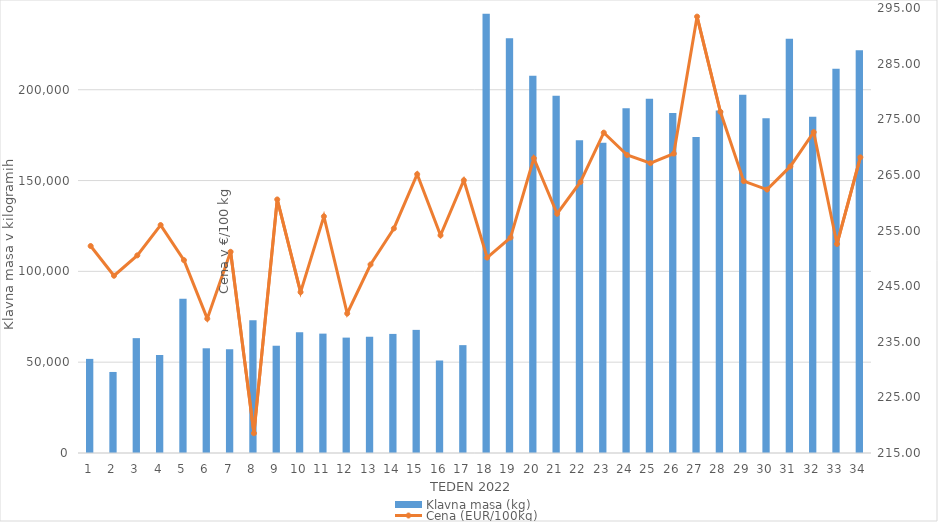
| Category | Klavna masa (kg) |
|---|---|
| 1.0 | 51818 |
| 2.0 | 44619 |
| 3.0 | 63233 |
| 4.0 | 53993 |
| 5.0 | 84871 |
| 6.0 | 57648 |
| 7.0 | 57159 |
| 8.0 | 73139 |
| 9.0 | 59056 |
| 10.0 | 66417 |
| 11.0 | 65723 |
| 12.0 | 63530 |
| 13.0 | 64069 |
| 14.0 | 65564 |
| 15.0 | 67787 |
| 16.0 | 50958 |
| 17.0 | 59387 |
| 18.0 | 241833 |
| 19.0 | 228389 |
| 20.0 | 207661 |
| 21.0 | 196732 |
| 22.0 | 172190 |
| 23.0 | 170751 |
| 24.0 | 189775 |
| 25.0 | 195029 |
| 26.0 | 187239 |
| 27.0 | 173967 |
| 28.0 | 188601 |
| 29.0 | 197293 |
| 30.0 | 184259 |
| 31.0 | 228023 |
| 32.0 | 185079 |
| 33.0 | 211612 |
| 34.0 | 221748 |